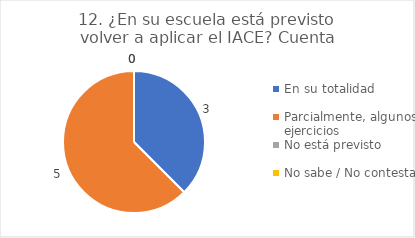
| Category | 12. ¿En su escuela está previsto volver a aplicar el IACE? |
|---|---|
| En su totalidad  | 0.375 |
| Parcialmente, algunos ejercicios  | 0.625 |
| No está previsto  | 0 |
| No sabe / No contesta | 0 |